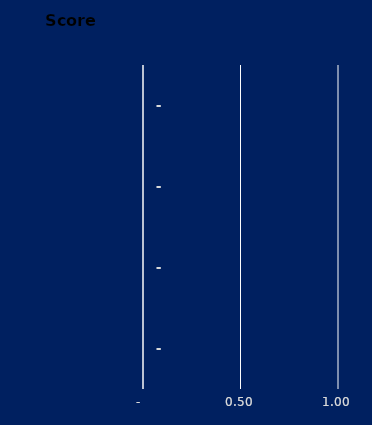
| Category | Series 0 |
|---|---|
| 1 a 2 vezes por semana | 0 |
| 3 a 4 vezes por semana | 0 |
| 5 a 7 vezes por semana | 0 |
| Nenhuma vez | 0 |